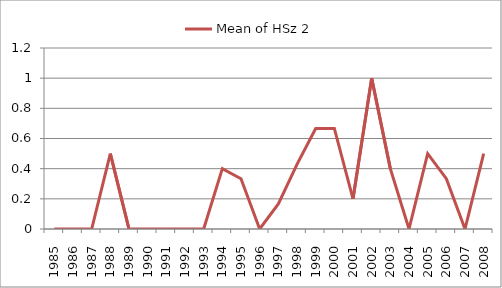
| Category | Mean of HSz 2 |
|---|---|
| 1985.0 | 0 |
| 1986.0 | 0 |
| 1987.0 | 0 |
| 1988.0 | 0.5 |
| 1989.0 | 0 |
| 1990.0 | 0 |
| 1991.0 | 0 |
| 1992.0 | 0 |
| 1993.0 | 0 |
| 1994.0 | 0.4 |
| 1995.0 | 0.333 |
| 1996.0 | 0 |
| 1997.0 | 0.167 |
| 1998.0 | 0.429 |
| 1999.0 | 0.667 |
| 2000.0 | 0.667 |
| 2001.0 | 0.2 |
| 2002.0 | 1 |
| 2003.0 | 0.4 |
| 2004.0 | 0 |
| 2005.0 | 0.5 |
| 2006.0 | 0.333 |
| 2007.0 | 0 |
| 2008.0 | 0.5 |